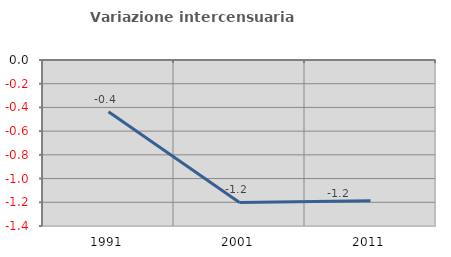
| Category | Variazione intercensuaria annua |
|---|---|
| 1991.0 | -0.436 |
| 2001.0 | -1.201 |
| 2011.0 | -1.188 |